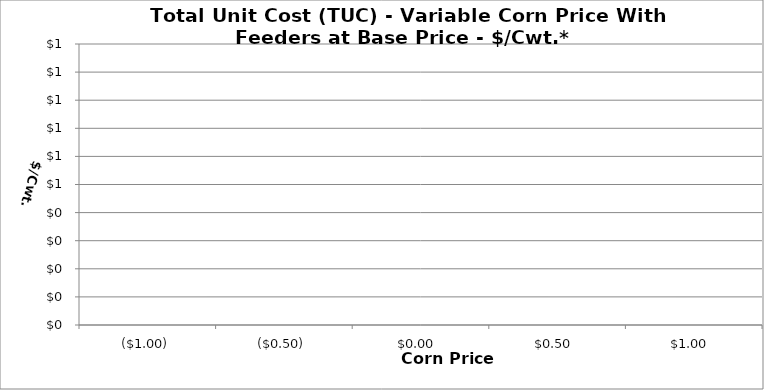
| Category | TUC |
|---|---|
| -1.0 | 0 |
| -0.5 | 0 |
| 0.0 | 0 |
| 0.5 | 0 |
| 1.0 | 0 |